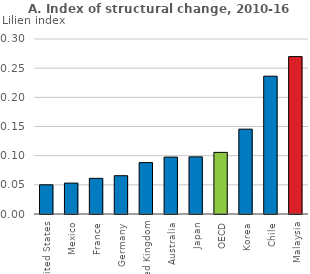
| Category | Series 0 |
|---|---|
| United States | 0.05 |
| Mexico | 0.053 |
| France | 0.061 |
| Germany | 0.066 |
| United Kingdom | 0.088 |
| Australia | 0.098 |
| Japan | 0.098 |
| OECD | 0.106 |
| Korea | 0.145 |
| Chile | 0.236 |
| Malaysia | 0.27 |